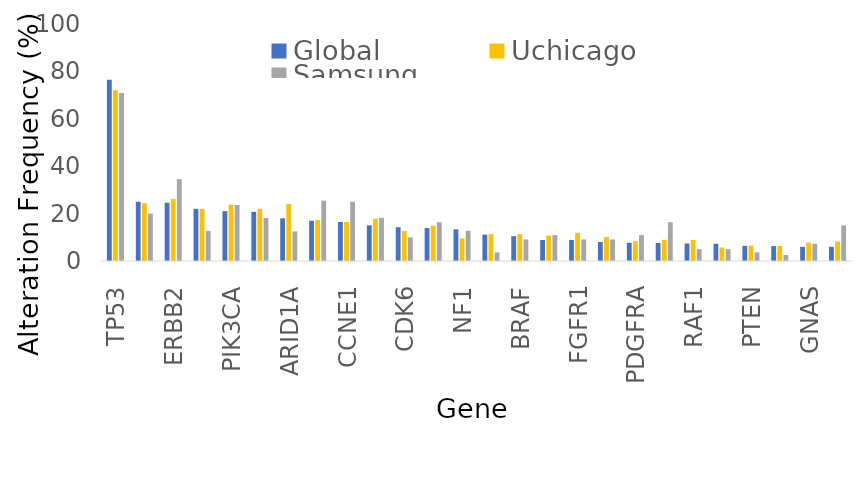
| Category | Global | Uchicago | Samsung |
|---|---|---|---|
| TP53 | 76.496 | 72.024 | 70.909 |
| EGFR | 25 | 24.405 | 20 |
| ERBB2 | 24.573 | 26.19 | 34.545 |
| KRAS | 22.009 | 22.024 | 12.727 |
| PIK3CA | 21.047 | 23.81 | 23.636 |
| MYC | 20.726 | 22.024 | 18.182 |
| ARID1A | 18.011 | 24.051 | 12.5 |
| MET | 16.987 | 17.262 | 25.455 |
| CCNE1 | 16.464 | 16.456 | 25 |
| APC | 15.064 | 17.857 | 18.182 |
| CDK6 | 14.254 | 12.658 | 10 |
| FGFR2 | 13.889 | 14.881 | 16.364 |
| NF1 | 13.355 | 9.524 | 12.727 |
| CDKN2A | 11.111 | 11.31 | 3.636 |
| BRAF | 10.47 | 11.31 | 9.091 |
| SMAD4 | 8.868 | 10.714 | 10.909 |
| FGFR1 | 8.868 | 11.905 | 9.091 |
| AR | 8.013 | 10.119 | 9.091 |
| PDGFRA | 7.692 | 8.333 | 10.909 |
| KIT | 7.585 | 8.929 | 16.364 |
| RAF1 | 7.403 | 8.861 | 5 |
| BRCA2 | 7.293 | 5.696 | 5 |
| PTEN | 6.41 | 6.548 | 3.636 |
| CCND1 | 6.298 | 6.329 | 2.5 |
| GNAS | 5.983 | 7.738 | 7.273 |
| BRCA1 | 5.967 | 8.228 | 15 |